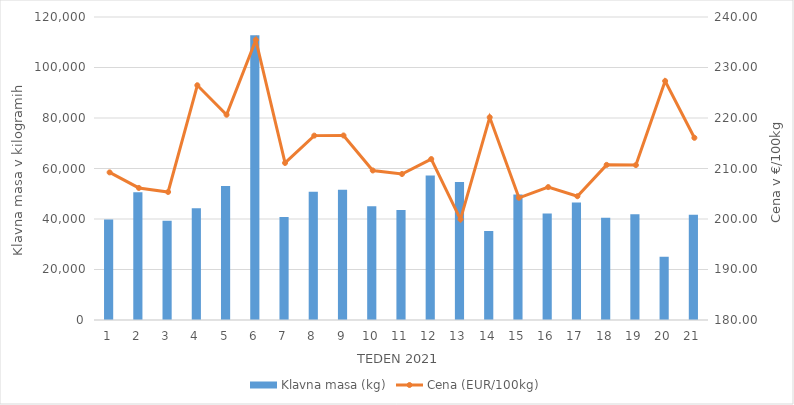
| Category | Klavna masa (kg) |
|---|---|
| 1.0 | 39814 |
| 2.0 | 50603 |
| 3.0 | 39295 |
| 4.0 | 44250 |
| 5.0 | 53061 |
| 6.0 | 112816 |
| 7.0 | 40829 |
| 8.0 | 50775 |
| 9.0 | 51535 |
| 10.0 | 45040 |
| 11.0 | 43536 |
| 12.0 | 57246 |
| 13.0 | 54680 |
| 14.0 | 35237 |
| 15.0 | 49721 |
| 16.0 | 42177 |
| 17.0 | 46525 |
| 18.0 | 40491 |
| 19.0 | 41888 |
| 20.0 | 25048 |
| 21.0 | 41651 |